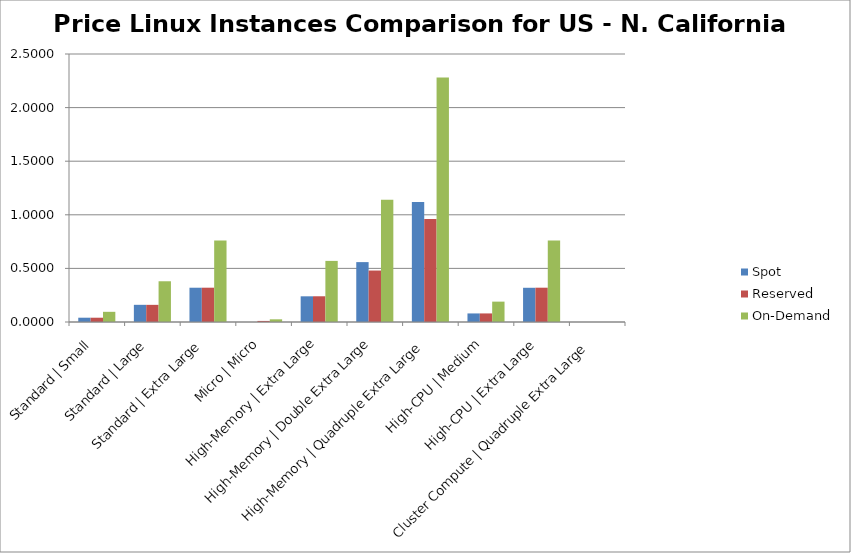
| Category | Spot | Reserved | On-Demand |
|---|---|---|---|
| Standard | Small | 0.04 | 0.04 | 0.095 |
| Standard | Large | 0.16 | 0.16 | 0.38 |
| Standard | Extra Large | 0.32 | 0.32 | 0.76 |
| Micro | Micro | 0 | 0.01 | 0.025 |
| High-Memory | Extra Large | 0.24 | 0.24 | 0.57 |
| High-Memory | Double Extra Large | 0.559 | 0.48 | 1.14 |
| High-Memory | Quadruple Extra Large | 1.119 | 0.96 | 2.28 |
| High-CPU | Medium | 0.08 | 0.08 | 0.19 |
| High-CPU | Extra Large | 0.319 | 0.32 | 0.76 |
| Cluster Compute | Quadruple Extra Large | 0 | 0 | 0 |